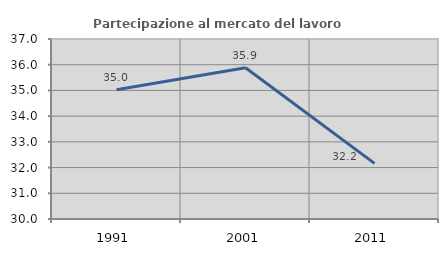
| Category | Partecipazione al mercato del lavoro  femminile |
|---|---|
| 1991.0 | 35.029 |
| 2001.0 | 35.884 |
| 2011.0 | 32.162 |